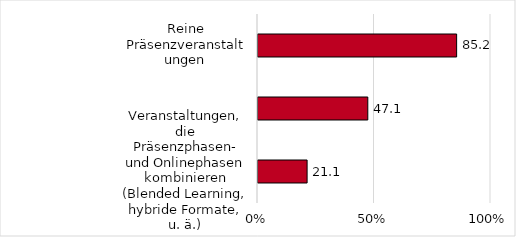
| Category | Series 0 |
|---|---|
| Reine Präsenzveranstaltungen | 85.249 |
| Reine Onlineveranstaltungen  | 47.126 |
| Veranstaltungen, die Präsenzphasen- und Onlinephasen kombinieren (Blended Learning, hybride Formate, u. ä.) | 21.073 |